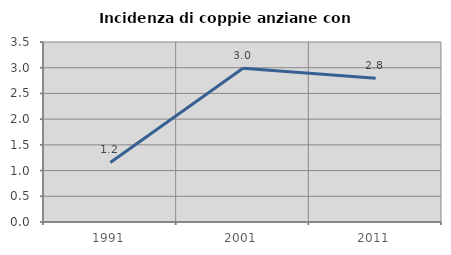
| Category | Incidenza di coppie anziane con figli |
|---|---|
| 1991.0 | 1.157 |
| 2001.0 | 2.99 |
| 2011.0 | 2.796 |